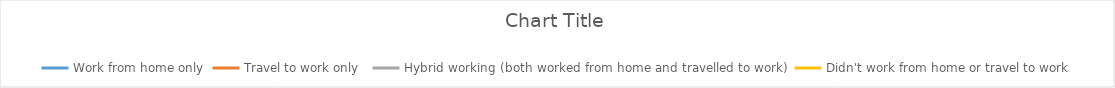
| Category | Work from home only | Travel to work only  | Hybrid working (both worked from home and travelled to work) | Didn't work from home or travel to work |
|---|---|---|---|---|
| 0 | 34 | 39 | 9 | 18 |
| 1 | 35 | 39 | 10 | 16 |
| 2 | 34 | 39 | 9 | 19 |
| 3 | 36 | 36 | 11 | 18 |
| 4 | 36 | 36 | 11 | 17 |
| 5 | 37 | 34 | 10 | 18 |
| 6 | 35 | 36 | 10 | 19 |
| 7 | 32 | 39 | 10 | 19 |
| 8 | 36 | 38 | 10 | 16 |
| 9 | 30 | 41 | 12 | 16 |
| 10 | 32 | 42 | 9 | 17 |
| 11 | 31 | 44 | 9 | 17 |
| 12 | 30 | 43 | 10 | 18 |
| 13 | 28 | 44 | 9 | 19 |
| 14 | 27 | 46 | 10 | 17 |
| 15 | 27 | 46 | 11 | 16 |
| 16 | 27 | 50 | 10 | 13 |
| 17 | 26 | 49 | 11 | 13 |
| 18 | 25 | 49 | 13 | 13 |
| 19 | 26 | 50 | 11 | 13 |
| 20 | 22 | 49 | 15 | 14 |
| 21 | 23 | 48 | 12 | 17 |
| 22 | 23 | 48 | 16 | 14 |
| 23 | 22 | 49 | 15 | 14 |
| 24 | 23 | 50 | 13 | 13 |
| 25 | 26 | 47 | 13 | 15 |
| 26 | 23 | 46 | 13 | 17 |
| 27 | 21 | 50 | 14 | 15 |
| 28 | 22 | 49 | 12 | 17 |
| 29 | 23 | 46 | 10 | 20 |
| 30 | 19 | 48 | 11 | 22 |
| 31 | 18 | 49 | 11 | 22 |
| 32 | 21 | 47 | 8 | 24 |
| 33 | 21 | 46 | 11 | 21 |
| 34 | 17 | 53 | 12 | 18 |
| 35 | 16 | 54 | 13 | 17 |
| 36 | 15 | 54 | 16 | 15 |
| 37 | 15 | 52 | 17 | 15 |
| 38 | 16 | 53 | 14 | 17 |
| 39 | 14 | 56 | 15 | 15 |
| 40 | 14 | 54 | 18 | 14 |
| 41 | 21 | 49 | 11 | 19 |
| 42 | 26 | 51 | 8 | 15 |
| 43 | 22 | 48 | 13 | 16 |
| 44 | 17 | 54 | 13 | 15 |
| 45 | 15 | 56 | 13 | 17 |
| 46 | 12 | 60 | 13 | 15 |
| 47 | 12 | 57 | 14 | 17 |
| 48 | 17 | 50 | 20 | 14 |
| 49 | 15 | 45 | 21 | 19 |
| 50 | 14 | 46 | 24 | 16 |
| 51 | 15 | 53 | 22 | 11 |
| 52 | 15 | 48 | 23 | 14 |
| 53 | 18 | 44 | 17 | 22 |
| 54 | 18 | 45 | 21 | 16 |
| 55 | 16 | 45 | 24 | 15 |
| 56 | 16 | 43 | 21 | 19 |